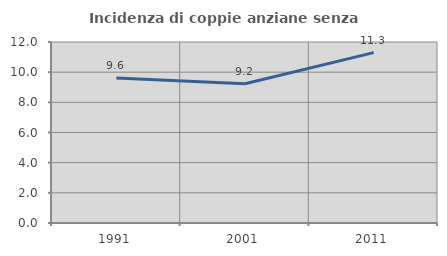
| Category | Incidenza di coppie anziane senza figli  |
|---|---|
| 1991.0 | 9.615 |
| 2001.0 | 9.236 |
| 2011.0 | 11.296 |